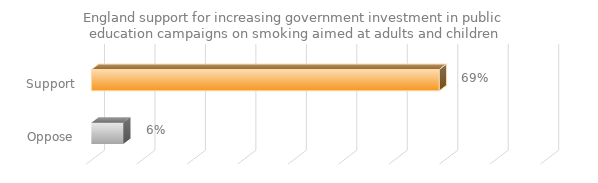
| Category | England support for increasing government investment in public education campaigns on smoking aimed at adults and children |
|---|---|
| Support | 0.689 |
| Oppose | 0.063 |